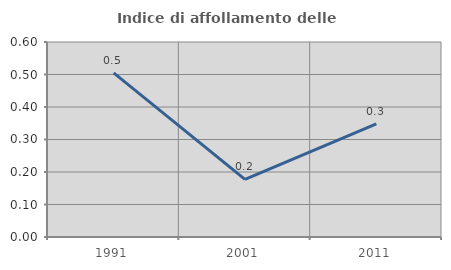
| Category | Indice di affollamento delle abitazioni  |
|---|---|
| 1991.0 | 0.505 |
| 2001.0 | 0.177 |
| 2011.0 | 0.348 |